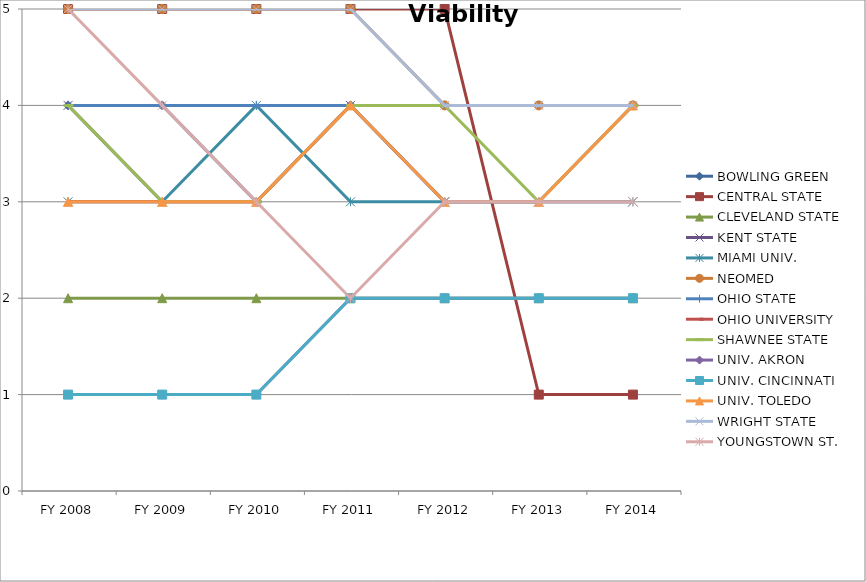
| Category | BOWLING GREEN  | CENTRAL STATE  | CLEVELAND STATE  | KENT STATE  | MIAMI UNIV.  | NEOMED  | OHIO STATE  | OHIO UNIVERSITY  | SHAWNEE STATE  | UNIV. AKRON  | UNIV. CINCINNATI  | UNIV. TOLEDO  | WRIGHT STATE  | YOUNGSTOWN ST.  |
|---|---|---|---|---|---|---|---|---|---|---|---|---|---|---|
| FY 2014 | 4 | 1 | 2 | 3 | 3 | 4 | 4 | 4 | 4 | 2 | 2 | 4 | 4 | 3 |
| FY 2013 | 4 | 1 | 2 | 3 | 3 | 4 | 3 | 4 | 3 | 2 | 2 | 3 | 4 | 3 |
| FY 2012 | 4 | 5 | 2 | 3 | 3 | 4 | 3 | 4 | 4 | 2 | 2 | 3 | 4 | 3 |
| FY 2011 | 4 | 5 | 2 | 4 | 3 | 5 | 4 | 4 | 4 | 2 | 2 | 4 | 5 | 2 |
| FY 2010 | 3 | 5 | 2 | 3 | 4 | 5 | 4 | 3 | 3 | 1 | 1 | 3 | 5 | 3 |
| FY 2009 | 4 | 5 | 2 | 3 | 3 | 5 | 4 | 3 | 3 | 1 | 1 | 3 | 5 | 4 |
| FY 2008 | 4 | 5 | 2 | 4 | 3 | 5 | 4 | 3 | 4 | 1 | 1 | 3 | 5 | 5 |